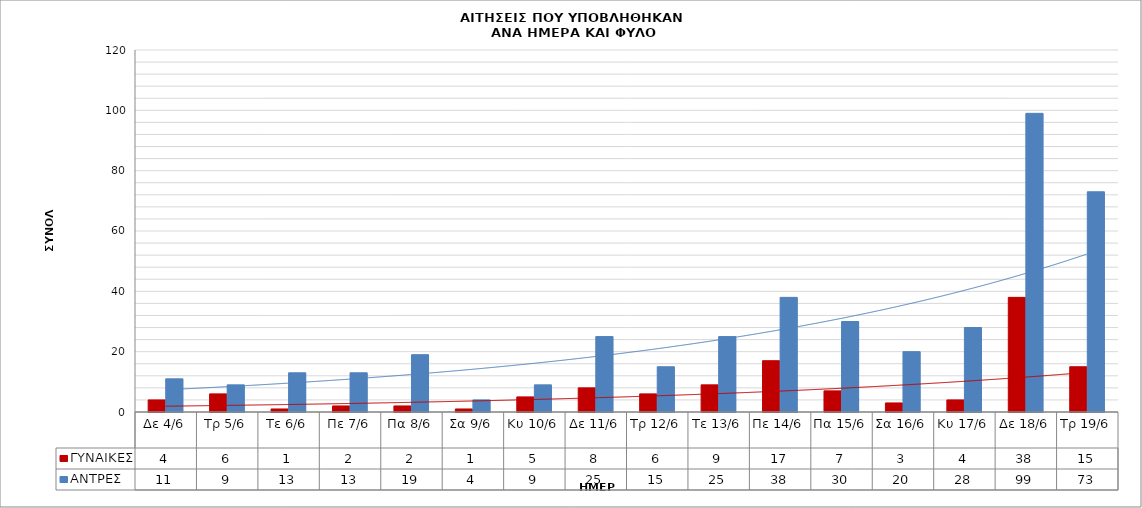
| Category | ΓΥΝΑΙΚΕΣ | ΑΝΤΡΕΣ |
|---|---|---|
| Δε 4/6 | 4 | 11 |
| Τρ 5/6 | 6 | 9 |
| Τε 6/6 | 1 | 13 |
| Πε 7/6 | 2 | 13 |
| Πα 8/6 | 2 | 19 |
| Σα 9/6 | 1 | 4 |
| Κυ 10/6 | 5 | 9 |
| Δε 11/6 | 8 | 25 |
| Τρ 12/6 | 6 | 15 |
| Τε 13/6 | 9 | 25 |
| Πε 14/6 | 17 | 38 |
| Πα 15/6 | 7 | 30 |
| Σα 16/6 | 3 | 20 |
| Κυ 17/6 | 4 | 28 |
| Δε 18/6 | 38 | 99 |
| Τρ 19/6 | 15 | 73 |